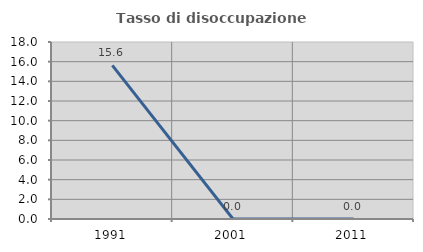
| Category | Tasso di disoccupazione giovanile  |
|---|---|
| 1991.0 | 15.625 |
| 2001.0 | 0 |
| 2011.0 | 0 |